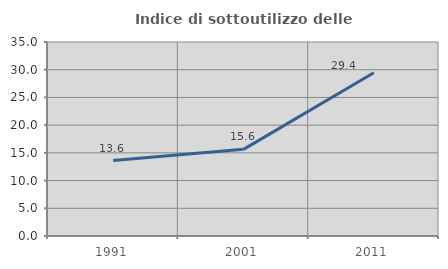
| Category | Indice di sottoutilizzo delle abitazioni  |
|---|---|
| 1991.0 | 13.605 |
| 2001.0 | 15.631 |
| 2011.0 | 29.446 |